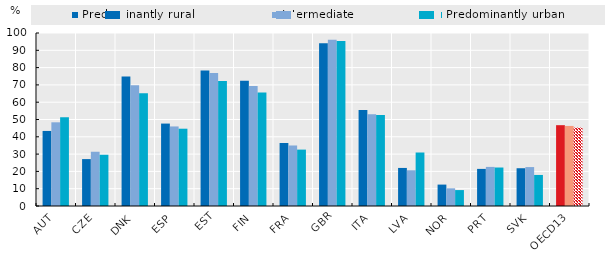
| Category | Predominantly rural | Intermediate | Predominantly urban |
|---|---|---|---|
| AUT | 43.387 | 48.378 | 51.23 |
| CZE | 27.113 | 31.358 | 29.62 |
| DNK | 74.8 | 69.743 | 65.157 |
| ESP | 47.645 | 45.985 | 44.678 |
| EST | 78.261 | 76.928 | 72.242 |
| FIN | 72.462 | 69.319 | 65.602 |
| FRA | 36.415 | 34.982 | 32.597 |
| GBR | 94.085 | 96.032 | 95.306 |
| ITA | 55.491 | 52.962 | 52.621 |
| LVA | 22.001 | 20.639 | 30.924 |
| NOR | 12.372 | 10.23 | 9.208 |
| PRT | 21.447 | 22.599 | 22.248 |
| SVK | 21.829 | 22.501 | 17.942 |
| OECD13 | 46.716 | 46.281 | 45.336 |